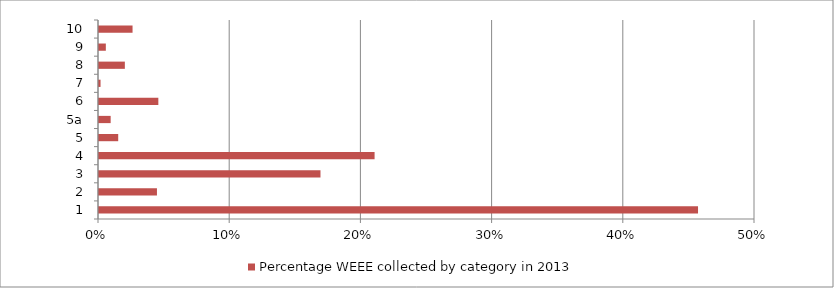
| Category | Percentage WEEE collected by category in 2013 |
|---|---|
| 1 | 0.457 |
| 2 | 0.044 |
| 3 | 0.169 |
| 4 | 0.21 |
| 5 | 0.015 |
| 5a | 0.009 |
| 6 | 0.045 |
| 7 | 0.001 |
| 8 | 0.02 |
| 9 | 0.005 |
| 10 | 0.026 |